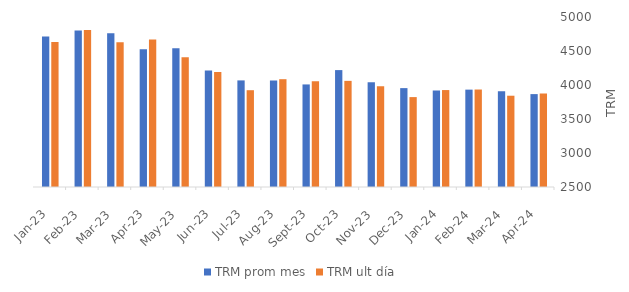
| Category | TRM prom mes | TRM ult día |
|---|---|---|
| 2023-01-01 | 4712.18 | 4632.2 |
| 2023-02-01 | 4802.75 | 4808.14 |
| 2023-03-01 | 4760.96 | 4627.27 |
| 2023-04-01 | 4526.03 | 4669 |
| 2023-05-01 | 4539.54 | 4408.65 |
| 2023-06-01 | 4213.53 | 4191.28 |
| 2023-07-01 | 4067.63 | 3923.49 |
| 2023-08-01 | 4066.87 | 4085.33 |
| 2023-09-01 | 4008.41 | 4053.76 |
| 2023-10-01 | 4219.16 | 4060.83 |
| 2023-11-01 | 4040.26 | 3980.67 |
| 2023-12-01 | 3954.14 | 3822.05 |
| 2024-01-01 | 3920.2 | 3925.6 |
| 2024-02-01 | 3931.85 | 3933.56 |
| 2024-03-01 | 3908.67 | 3842.3 |
| 2024-04-01 | 3866.12 | 3873.44 |